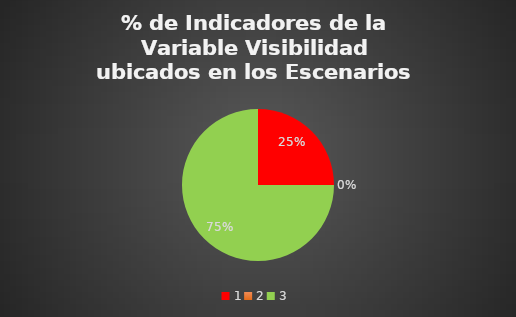
| Category | Series 0 |
|---|---|
| 0 | 0.25 |
| 1 | 0 |
| 2 | 0.75 |